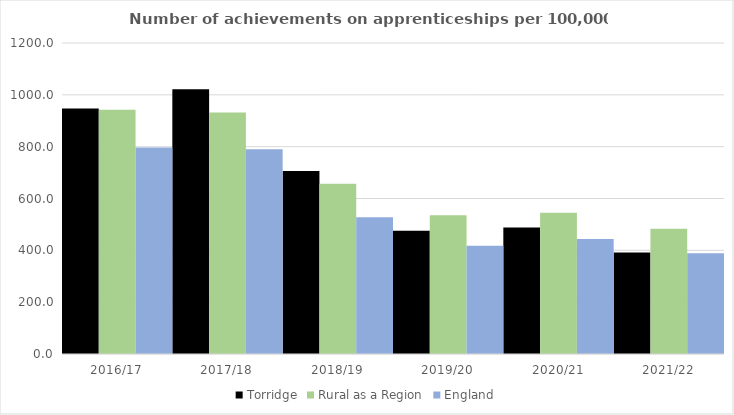
| Category | Torridge | Rural as a Region | England |
|---|---|---|---|
| 2016/17 | 947 | 942.594 | 797 |
| 2017/18 | 1022 | 931.709 | 790 |
| 2018/19 | 706 | 656.44 | 528 |
| 2019/20 | 476 | 535.552 | 418 |
| 2020/21 | 488 | 545.333 | 444 |
| 2021/22 | 392 | 482.936 | 389 |